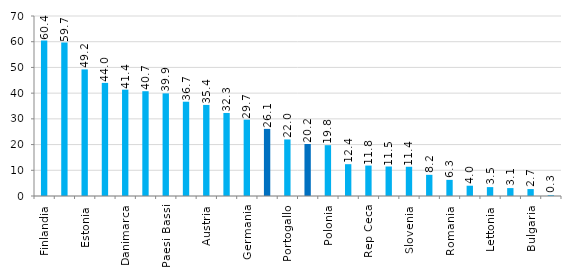
| Category | Series 0 |
|---|---|
| Finlandia | 60.441 |
| Svezia | 59.665 |
| Estonia | 49.228 |
| Belgio | 43.985 |
| Danimarca | 41.35 |
| Lussemburgo | 40.748 |
| Paesi Bassi | 39.909 |
| Lituania | 36.667 |
| Austria | 35.42 |
| Francia | 32.291 |
| Germania | 29.694 |
| UE | 26.097 |
| Portogallo | 21.995 |
| Italia | 20.22 |
| Polonia | 19.76 |
| Ungheria | 12.37 |
| Rep Ceca | 11.83 |
| Spagna | 11.469 |
| Slovenia | 11.372 |
| Slovacchia | 8.233 |
| Romania | 6.268 |
| Malta | 4 |
| Lettonia | 3.456 |
| Cipro | 3.077 |
| Bulgaria | 2.699 |
| Croazia | 0.314 |